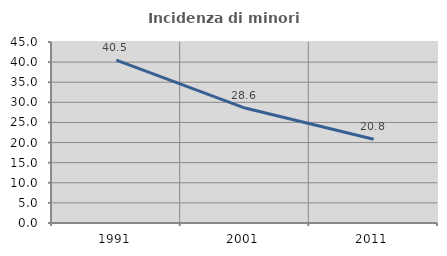
| Category | Incidenza di minori stranieri |
|---|---|
| 1991.0 | 40.476 |
| 2001.0 | 28.571 |
| 2011.0 | 20.833 |